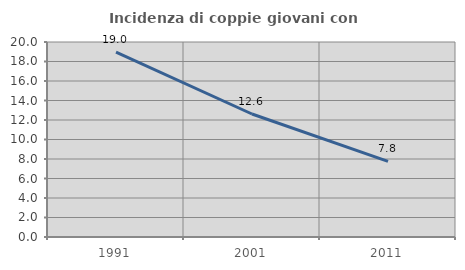
| Category | Incidenza di coppie giovani con figli |
|---|---|
| 1991.0 | 18.965 |
| 2001.0 | 12.615 |
| 2011.0 | 7.758 |